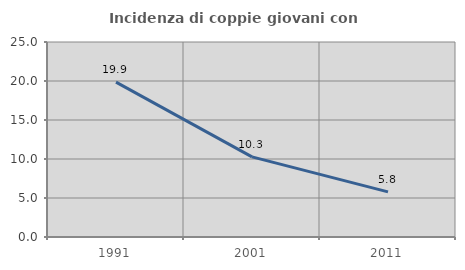
| Category | Incidenza di coppie giovani con figli |
|---|---|
| 1991.0 | 19.861 |
| 2001.0 | 10.27 |
| 2011.0 | 5.781 |